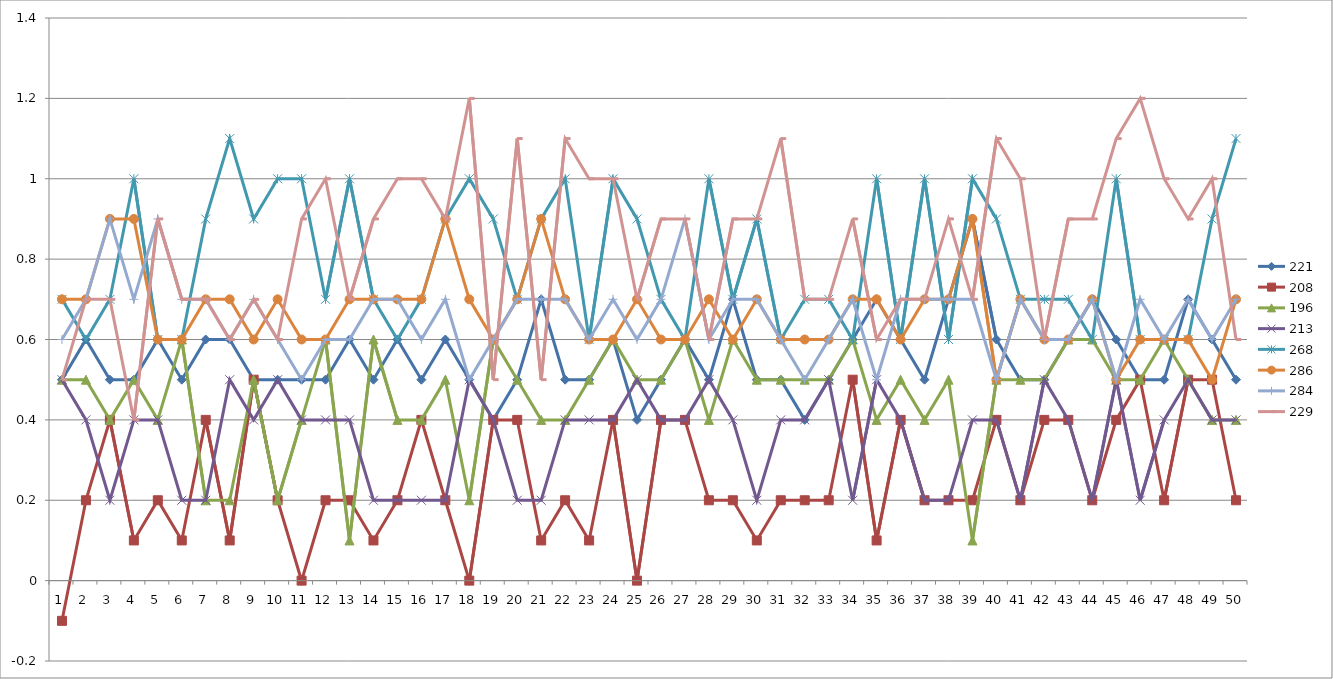
| Category | 221 | 208 | 196 | 213 | 268 | 286 | 284 | 229 |
|---|---|---|---|---|---|---|---|---|
| 0 | 0.5 | -0.1 | 0.5 | 0.5 | 0.7 | 0.7 | 0.6 | 0.5 |
| 1 | 0.6 | 0.2 | 0.5 | 0.4 | 0.6 | 0.7 | 0.7 | 0.7 |
| 2 | 0.5 | 0.4 | 0.4 | 0.2 | 0.7 | 0.9 | 0.9 | 0.7 |
| 3 | 0.5 | 0.1 | 0.5 | 0.4 | 1 | 0.9 | 0.7 | 0.4 |
| 4 | 0.6 | 0.2 | 0.4 | 0.4 | 0.6 | 0.6 | 0.9 | 0.9 |
| 5 | 0.5 | 0.1 | 0.6 | 0.2 | 0.6 | 0.6 | 0.7 | 0.7 |
| 6 | 0.6 | 0.4 | 0.2 | 0.2 | 0.9 | 0.7 | 0.7 | 0.7 |
| 7 | 0.6 | 0.1 | 0.2 | 0.5 | 1.1 | 0.7 | 0.6 | 0.6 |
| 8 | 0.5 | 0.5 | 0.5 | 0.4 | 0.9 | 0.6 | 0.7 | 0.7 |
| 9 | 0.5 | 0.2 | 0.2 | 0.5 | 1 | 0.7 | 0.6 | 0.6 |
| 10 | 0.5 | 0 | 0.4 | 0.4 | 1 | 0.6 | 0.5 | 0.9 |
| 11 | 0.5 | 0.2 | 0.6 | 0.4 | 0.7 | 0.6 | 0.6 | 1 |
| 12 | 0.6 | 0.2 | 0.1 | 0.4 | 1 | 0.7 | 0.6 | 0.7 |
| 13 | 0.5 | 0.1 | 0.6 | 0.2 | 0.7 | 0.7 | 0.7 | 0.9 |
| 14 | 0.6 | 0.2 | 0.4 | 0.2 | 0.6 | 0.7 | 0.7 | 1 |
| 15 | 0.5 | 0.4 | 0.4 | 0.2 | 0.7 | 0.7 | 0.6 | 1 |
| 16 | 0.6 | 0.2 | 0.5 | 0.2 | 0.9 | 0.9 | 0.7 | 0.9 |
| 17 | 0.5 | 0 | 0.2 | 0.5 | 1 | 0.7 | 0.5 | 1.2 |
| 18 | 0.4 | 0.4 | 0.6 | 0.4 | 0.9 | 0.6 | 0.6 | 0.5 |
| 19 | 0.5 | 0.4 | 0.5 | 0.2 | 0.7 | 0.7 | 0.7 | 1.1 |
| 20 | 0.7 | 0.1 | 0.4 | 0.2 | 0.9 | 0.9 | 0.7 | 0.5 |
| 21 | 0.5 | 0.2 | 0.4 | 0.4 | 1 | 0.7 | 0.7 | 1.1 |
| 22 | 0.5 | 0.1 | 0.5 | 0.4 | 0.6 | 0.6 | 0.6 | 1 |
| 23 | 0.6 | 0.4 | 0.6 | 0.4 | 1 | 0.6 | 0.7 | 1 |
| 24 | 0.4 | 0 | 0.5 | 0.5 | 0.9 | 0.7 | 0.6 | 0.7 |
| 25 | 0.5 | 0.4 | 0.5 | 0.4 | 0.7 | 0.6 | 0.7 | 0.9 |
| 26 | 0.6 | 0.4 | 0.6 | 0.4 | 0.6 | 0.6 | 0.9 | 0.9 |
| 27 | 0.5 | 0.2 | 0.4 | 0.5 | 1 | 0.7 | 0.6 | 0.6 |
| 28 | 0.7 | 0.2 | 0.6 | 0.4 | 0.7 | 0.6 | 0.7 | 0.9 |
| 29 | 0.5 | 0.1 | 0.5 | 0.2 | 0.9 | 0.7 | 0.7 | 0.9 |
| 30 | 0.5 | 0.2 | 0.5 | 0.4 | 0.6 | 0.6 | 0.6 | 1.1 |
| 31 | 0.4 | 0.2 | 0.5 | 0.4 | 0.7 | 0.6 | 0.5 | 0.7 |
| 32 | 0.5 | 0.2 | 0.5 | 0.5 | 0.7 | 0.6 | 0.6 | 0.7 |
| 33 | 0.6 | 0.5 | 0.6 | 0.2 | 0.6 | 0.7 | 0.7 | 0.9 |
| 34 | 0.7 | 0.1 | 0.4 | 0.5 | 1 | 0.7 | 0.5 | 0.6 |
| 35 | 0.6 | 0.4 | 0.5 | 0.4 | 0.6 | 0.6 | 0.7 | 0.7 |
| 36 | 0.5 | 0.2 | 0.4 | 0.2 | 1 | 0.7 | 0.7 | 0.7 |
| 37 | 0.7 | 0.2 | 0.5 | 0.2 | 0.6 | 0.7 | 0.7 | 0.9 |
| 38 | 0.9 | 0.2 | 0.1 | 0.4 | 1 | 0.9 | 0.7 | 0.7 |
| 39 | 0.6 | 0.4 | 0.5 | 0.4 | 0.9 | 0.5 | 0.5 | 1.1 |
| 40 | 0.5 | 0.2 | 0.5 | 0.2 | 0.7 | 0.7 | 0.7 | 1 |
| 41 | 0.5 | 0.4 | 0.5 | 0.5 | 0.7 | 0.6 | 0.6 | 0.6 |
| 42 | 0.6 | 0.4 | 0.6 | 0.4 | 0.7 | 0.6 | 0.6 | 0.9 |
| 43 | 0.7 | 0.2 | 0.6 | 0.2 | 0.6 | 0.7 | 0.7 | 0.9 |
| 44 | 0.6 | 0.4 | 0.5 | 0.5 | 1 | 0.5 | 0.5 | 1.1 |
| 45 | 0.5 | 0.5 | 0.5 | 0.2 | 0.6 | 0.6 | 0.7 | 1.2 |
| 46 | 0.5 | 0.2 | 0.6 | 0.4 | 0.6 | 0.6 | 0.6 | 1 |
| 47 | 0.7 | 0.5 | 0.5 | 0.5 | 0.6 | 0.6 | 0.7 | 0.9 |
| 48 | 0.6 | 0.5 | 0.4 | 0.4 | 0.9 | 0.5 | 0.6 | 1 |
| 49 | 0.5 | 0.2 | 0.4 | 0.4 | 1.1 | 0.7 | 0.7 | 0.6 |